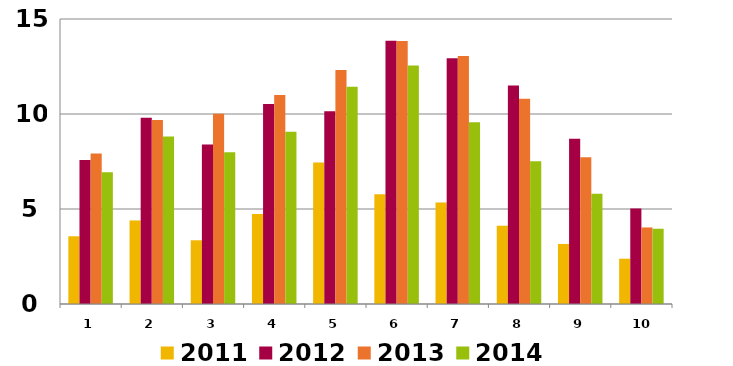
| Category | 2011 | 2012 | 2013 | 2014 |
|---|---|---|---|---|
| 1.0 | 3.565 | 7.577 | 7.921 | 6.933 |
| 2.0 | 4.398 | 9.807 | 9.68 | 8.81 |
| 3.0 | 3.354 | 8.393 | 10.01 | 7.989 |
| 4.0 | 4.741 | 10.529 | 10.999 | 9.066 |
| 5.0 | 7.443 | 10.149 | 12.317 | 11.438 |
| 6.0 | 5.779 | 13.852 | 13.84 | 12.554 |
| 7.0 | 5.346 | 12.941 | 13.055 | 9.569 |
| 8.0 | 4.119 | 11.502 | 10.808 | 7.517 |
| 9.0 | 3.161 | 8.696 | 7.728 | 5.807 |
| 10.0 | 2.383 | 5.025 | 4.029 | 3.96 |